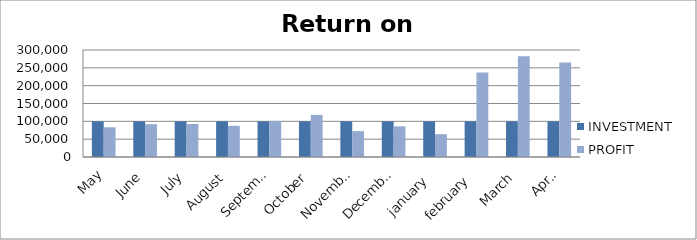
| Category | INVESTMENT  | PROFIT |
|---|---|---|
| May | 100000 | 83275 |
| June | 100000 | 91850 |
| July | 100000 | 92549 |
| August | 100000 | 87395 |
| September | 100000 | 101179 |
| October | 100000 | 117981 |
| November | 100000 | 72507 |
| December | 100000 | 85934 |
| january  | 100000 | 63911 |
| february  | 100000 | 236590 |
| March | 100000 | 282350 |
| April | 100000 | 265150 |